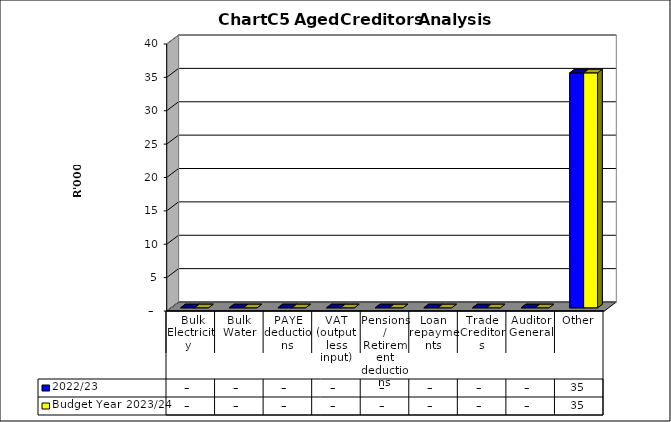
| Category | 2022/23 | Budget Year 2023/24 |
|---|---|---|
|  Bulk Electricity  | 0 | 0 |
| Bulk Water | 0 | 0 |
| PAYE deductions | 0 | 0 |
| VAT (output less input) | 0 | 0 |
| Pensions / Retirement deductions | 0 | 0 |
| Loan repayments | 0 | 0 |
| Trade Creditors | 0 | 0 |
| Auditor General | 0 | 0 |
| Other | 35197 | 35197 |